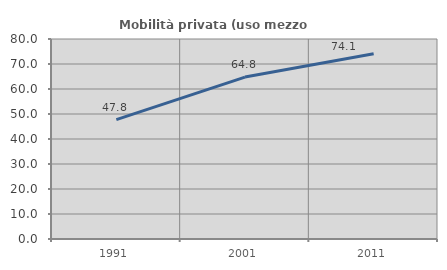
| Category | Mobilità privata (uso mezzo privato) |
|---|---|
| 1991.0 | 47.764 |
| 2001.0 | 64.774 |
| 2011.0 | 74.12 |